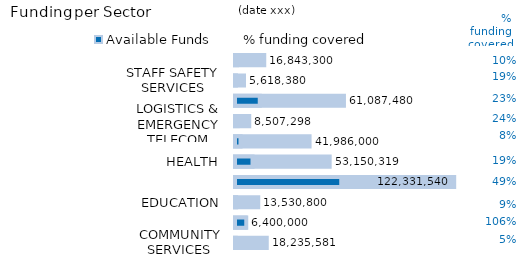
| Category | Funding requirement | Available Funds | % funding covered |
|---|---|---|---|
| COMMUNITY SERVICES | 18235581 | 962419 | 0.053 |
| COORDINATION | 6400000 | 6781864 | 1.06 |
| EDUCATION | 13530800 | 1175288 | 0.087 |
| FOOD | 122331540 | 59574651 | 0.487 |
| HEALTH | 53150319 | 10226246 | 0.192 |
| LIVELIHOODS | 41986000 | 3549699 | 0.085 |
| LOGISTICS & EMERGENCY TELECOM | 8507298 | 2043561 | 0.24 |
| NFIs AND SHELTER | 61087480 | 14303395 | 0.234 |
| STAFF SAFETY SERVICES | 5618380 | 1076398 | 0.192 |
| WASH | 16843300 | 1741800 | 0.103 |